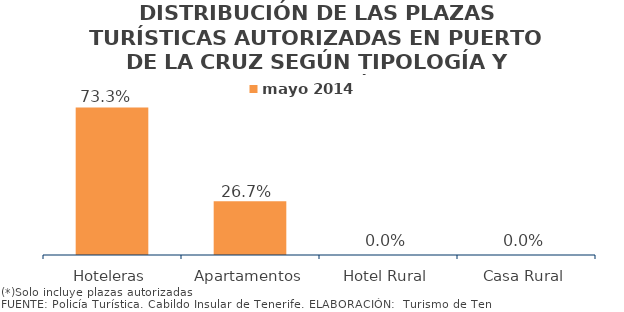
| Category | mayo 2014 |
|---|---|
| Hoteleras | 0.733 |
| Apartamentos | 0.267 |
| Hotel Rural | 0 |
| Casa Rural | 0 |